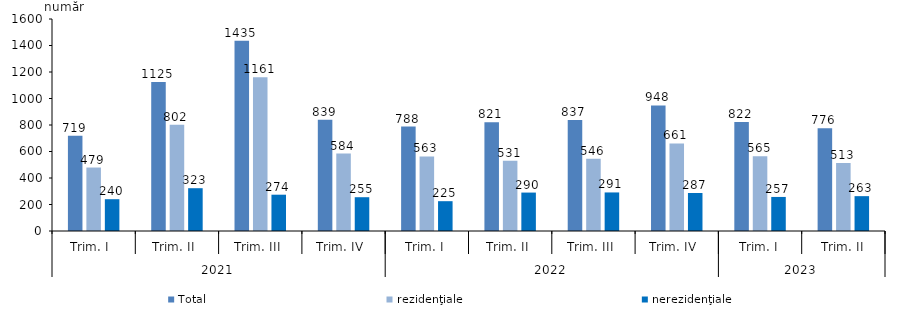
| Category | Total | rezidenţiale | nerezidenţiale |
|---|---|---|---|
| 0 | 719 | 479 | 240 |
| 1 | 1125 | 802 | 323 |
| 2 | 1435 | 1161 | 274 |
| 3 | 839 | 584 | 255 |
| 4 | 788 | 563 | 225 |
| 5 | 821 | 531 | 290 |
| 6 | 837 | 546 | 291 |
| 7 | 948 | 661 | 287 |
| 8 | 822 | 565 | 257 |
| 9 | 776 | 513 | 263 |